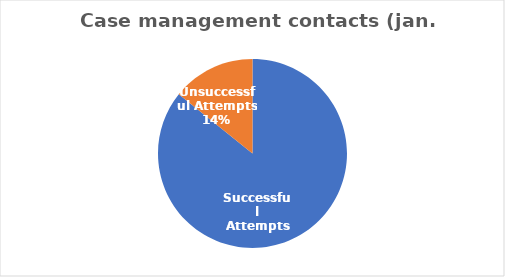
| Category | Series 0 |
|---|---|
| Successful Attempts | 265 |
| Unsuccessful Attempts | 44 |